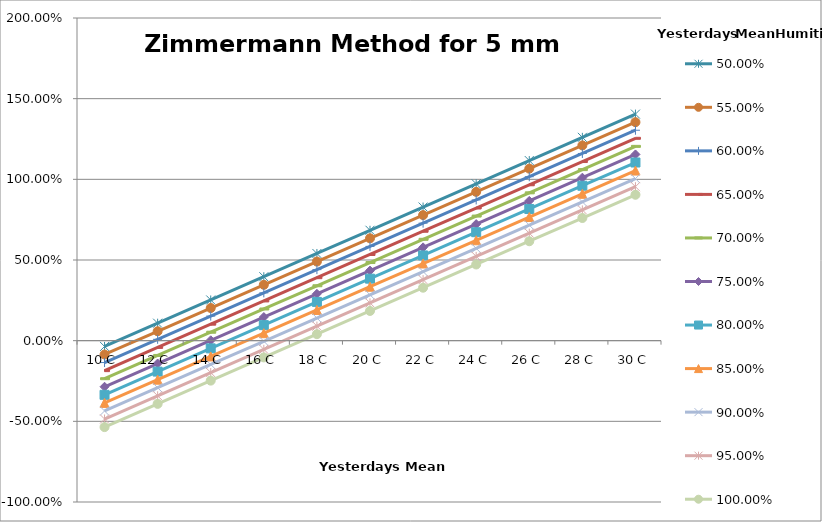
| Category | 50,00% | 55,00% | 60,00% | 65,00% | 70,00% | 75,00% | 80,00% | 85,00% | 90,00% | 95,00% | 100,00% |
|---|---|---|---|---|---|---|---|---|---|---|---|
| 10.0 | -0.036 | -0.086 | -0.136 | -0.186 | -0.236 | -0.286 | -0.336 | -0.386 | -0.436 | -0.486 | -0.536 |
| 12.0 | 0.108 | 0.058 | 0.008 | -0.042 | -0.092 | -0.142 | -0.192 | -0.242 | -0.292 | -0.342 | -0.392 |
| 14.0 | 0.252 | 0.202 | 0.152 | 0.102 | 0.052 | 0.002 | -0.048 | -0.098 | -0.148 | -0.198 | -0.248 |
| 16.0 | 0.396 | 0.346 | 0.296 | 0.246 | 0.196 | 0.146 | 0.096 | 0.046 | -0.004 | -0.054 | -0.104 |
| 18.0 | 0.54 | 0.49 | 0.44 | 0.39 | 0.34 | 0.29 | 0.24 | 0.19 | 0.14 | 0.09 | 0.04 |
| 20.0 | 0.684 | 0.634 | 0.584 | 0.534 | 0.484 | 0.434 | 0.384 | 0.334 | 0.284 | 0.234 | 0.184 |
| 22.0 | 0.828 | 0.778 | 0.728 | 0.678 | 0.628 | 0.578 | 0.528 | 0.478 | 0.428 | 0.378 | 0.328 |
| 24.0 | 0.972 | 0.922 | 0.872 | 0.822 | 0.772 | 0.722 | 0.672 | 0.622 | 0.572 | 0.522 | 0.472 |
| 26.0 | 1.116 | 1.066 | 1.016 | 0.966 | 0.916 | 0.866 | 0.816 | 0.766 | 0.716 | 0.666 | 0.616 |
| 28.0 | 1.26 | 1.21 | 1.16 | 1.11 | 1.06 | 1.01 | 0.96 | 0.91 | 0.86 | 0.81 | 0.76 |
| 30.0 | 1.404 | 1.354 | 1.304 | 1.254 | 1.204 | 1.154 | 1.104 | 1.054 | 1.004 | 0.954 | 0.904 |